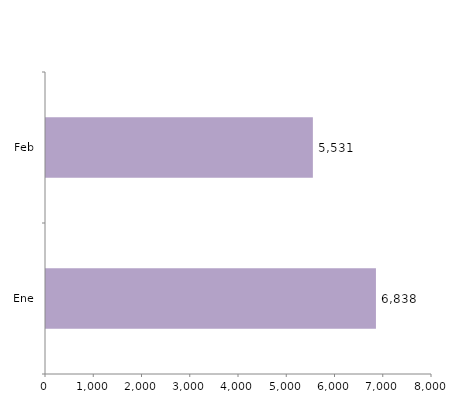
| Category | Series 0 |
|---|---|
| Ene | 6838 |
| Feb | 5531 |